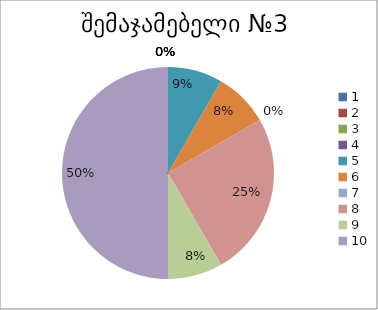
| Category | რაოდენობა | ქულა |
|---|---|---|
| 0 | 0 | 1 |
| 1 | 0 | 2 |
| 2 | 0 | 3 |
| 3 | 0 | 4 |
| 4 | 1 | 5 |
| 5 | 1 | 6 |
| 6 | 0 | 7 |
| 7 | 3 | 8 |
| 8 | 1 | 9 |
| 9 | 6 | 10 |